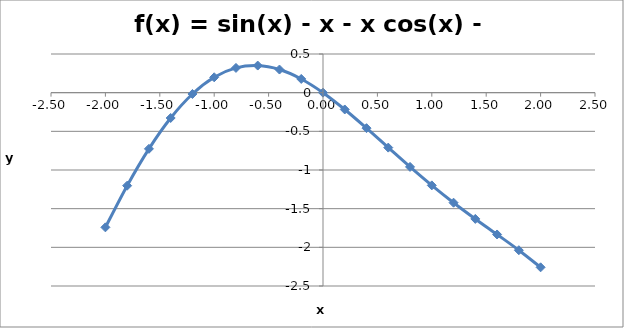
| Category | Series 0 |
|---|---|
| -2.0 | -1.742 |
| -1.8 | -1.203 |
| -1.6 | -0.726 |
| -1.4000000000000001 | -0.327 |
| -1.2000000000000002 | -0.017 |
| -1.0000000000000002 | 0.199 |
| -0.8000000000000003 | 0.32 |
| -0.6000000000000003 | 0.351 |
| -0.4000000000000003 | 0.299 |
| -0.2000000000000003 | 0.177 |
| -2.7755575615628914e-16 | 0 |
| 0.19999999999999973 | -0.217 |
| 0.39999999999999974 | -0.459 |
| 0.5999999999999998 | -0.711 |
| 0.7999999999999998 | -0.96 |
| 0.9999999999999998 | -1.199 |
| 1.1999999999999997 | -1.423 |
| 1.3999999999999997 | -1.633 |
| 1.5999999999999996 | -1.834 |
| 1.7999999999999996 | -2.037 |
| 1.9999999999999996 | -2.258 |